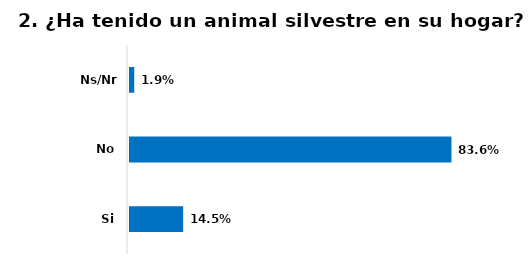
| Category | Series 0 |
|---|---|
| Si | 0.145 |
| No | 0.836 |
| Ns/Nr | 0.019 |